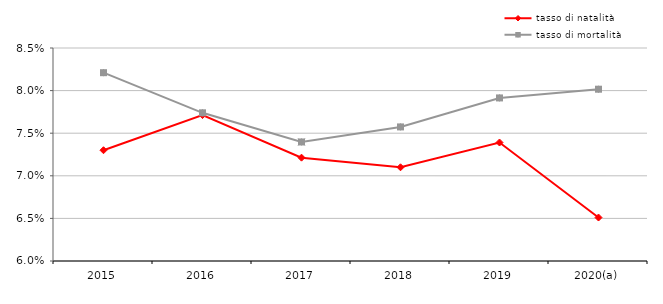
| Category | tasso di natalità | tasso di mortalità |
|---|---|---|
| 2015 | 0.073 | 0.082 |
| 2016 | 0.077 | 0.077 |
| 2017 | 0.072 | 0.074 |
| 2018 | 0.071 | 0.076 |
| 2019 | 0.074 | 0.079 |
| 2020(a) | 0.065 | 0.08 |